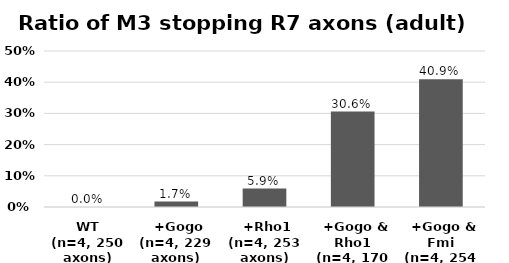
| Category | Series 0 |
|---|---|
| WT
(n=4, 250 axons) | 0 |
|  +Gogo
(n=4, 229 axons) | 0.017 |
|  +Rho1
(n=4, 253 axons) | 0.059 |
|  +Gogo & Rho1
(n=4, 170 axons) | 0.306 |
|  +Gogo & Fmi
(n=4, 254 axons) | 0.409 |